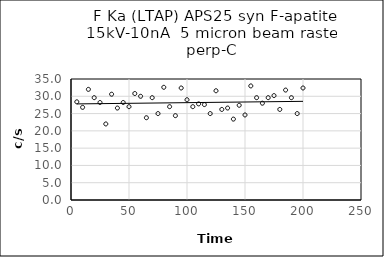
| Category | Series 0 |
|---|---|
| 5.0 | 28.4 |
| 10.0 | 26.8 |
| 15.0 | 32 |
| 20.0 | 29.6 |
| 25.0 | 28.2 |
| 30.0 | 22 |
| 35.0 | 30.6 |
| 40.0 | 26.6 |
| 45.0 | 28.2 |
| 50.0 | 27 |
| 55.0 | 30.8 |
| 60.0 | 30 |
| 65.0 | 23.8 |
| 70.0 | 29.6 |
| 75.0 | 25 |
| 80.0 | 32.6 |
| 85.0 | 27 |
| 90.0 | 24.4 |
| 95.0 | 32.4 |
| 100.0 | 29 |
| 105.0 | 27 |
| 110.0 | 27.8 |
| 115.0 | 27.6 |
| 120.0 | 25 |
| 125.0 | 31.6 |
| 130.0 | 26.2 |
| 135.0 | 26.6 |
| 140.0 | 23.4 |
| 145.0 | 27.4 |
| 150.0 | 24.6 |
| 155.0 | 33 |
| 160.0 | 29.6 |
| 165.0 | 28 |
| 170.0 | 29.6 |
| 175.0 | 30.2 |
| 180.0 | 26.2 |
| 185.0 | 31.8 |
| 190.0 | 29.6 |
| 195.0 | 25 |
| 200.0 | 32.4 |